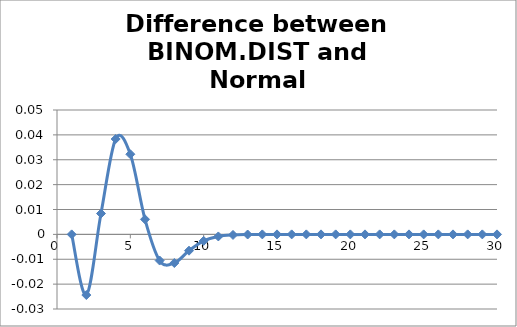
| Category | Series 0 |
|---|---|
| 0 | 0 |
| 1 | -0.024 |
| 2 | 0.008 |
| 3 | 0.038 |
| 4 | 0.032 |
| 5 | 0.006 |
| 6 | -0.011 |
| 7 | -0.012 |
| 8 | -0.007 |
| 9 | -0.003 |
| 10 | -0.001 |
| 11 | 0 |
| 12 | 0 |
| 13 | 0 |
| 14 | 0 |
| 15 | 0 |
| 16 | 0 |
| 17 | 0 |
| 18 | 0 |
| 19 | 0 |
| 20 | 0 |
| 21 | 0 |
| 22 | 0 |
| 23 | 0 |
| 24 | 0 |
| 25 | 0 |
| 26 | 0 |
| 27 | 0 |
| 28 | 0 |
| 29 | 0 |
| 30 | 0 |
| 31 | 0 |
| 32 | 0 |
| 33 | 0 |
| 34 | 0 |
| 35 | 0 |
| 36 | 0 |
| 37 | 0 |
| 38 | 0 |
| 39 | 0 |
| 40 | 0 |
| 41 | 0 |
| 42 | 0 |
| 43 | 0 |
| 44 | 0 |
| 45 | 0 |
| 46 | 0 |
| 47 | 0 |
| 48 | 0 |
| 49 | 0 |
| 50 | 0 |
| 51 | 0 |
| 52 | 0 |
| 53 | 0 |
| 54 | 0 |
| 55 | 0 |
| 56 | 0 |
| 57 | 0 |
| 58 | 0 |
| 59 | 0 |
| 60 | 0 |
| 61 | 0 |
| 62 | 0 |
| 63 | 0 |
| 64 | 0 |
| 65 | 0 |
| 66 | 0 |
| 67 | 0 |
| 68 | 0 |
| 69 | 0 |
| 70 | 0 |
| 71 | 0 |
| 72 | 0 |
| 73 | 0 |
| 74 | 0 |
| 75 | 0 |
| 76 | 0 |
| 77 | 0 |
| 78 | 0 |
| 79 | 0 |
| 80 | 0 |
| 81 | 0 |
| 82 | 0 |
| 83 | 0 |
| 84 | 0 |
| 85 | 0 |
| 86 | 0 |
| 87 | 0 |
| 88 | 0 |
| 89 | 0 |
| 90 | 0 |
| 91 | 0 |
| 92 | 0 |
| 93 | 0 |
| 94 | 0 |
| 95 | 0 |
| 96 | 0 |
| 97 | 0 |
| 98 | 0 |
| 99 | 0 |
| 100 | 0 |
| 101 | 0 |
| 102 | 0 |
| 103 | 0 |
| 104 | 0 |
| 105 | 0 |
| 106 | 0 |
| 107 | 0 |
| 108 | 0 |
| 109 | 0 |
| 110 | 0 |
| 111 | 0 |
| 112 | 0 |
| 113 | 0 |
| 114 | 0 |
| 115 | 0 |
| 116 | 0 |
| 117 | 0 |
| 118 | 0 |
| 119 | 0 |
| 120 | 0 |
| 121 | 0 |
| 122 | 0 |
| 123 | 0 |
| 124 | 0 |
| 125 | 0 |
| 126 | 0 |
| 127 | 0 |
| 128 | 0 |
| 129 | 0 |
| 130 | 0 |
| 131 | 0 |
| 132 | 0 |
| 133 | 0 |
| 134 | 0 |
| 135 | 0 |
| 136 | 0 |
| 137 | 0 |
| 138 | 0 |
| 139 | 0 |
| 140 | 0 |
| 141 | 0 |
| 142 | 0 |
| 143 | 0 |
| 144 | 0 |
| 145 | 0 |
| 146 | 0 |
| 147 | 0 |
| 148 | 0 |
| 149 | 0 |
| 150 | 0 |
| 151 | 0 |
| 152 | 0 |
| 153 | 0 |
| 154 | 0 |
| 155 | 0 |
| 156 | 0 |
| 157 | 0 |
| 158 | 0 |
| 159 | 0 |
| 160 | 0 |
| 161 | 0 |
| 162 | 0 |
| 163 | 0 |
| 164 | 0 |
| 165 | 0 |
| 166 | 0 |
| 167 | 0 |
| 168 | 0 |
| 169 | 0 |
| 170 | 0 |
| 171 | 0 |
| 172 | 0 |
| 173 | 0 |
| 174 | 0 |
| 175 | 0 |
| 176 | 0 |
| 177 | 0 |
| 178 | 0 |
| 179 | 0 |
| 180 | 0 |
| 181 | 0 |
| 182 | 0 |
| 183 | 0 |
| 184 | 0 |
| 185 | 0 |
| 186 | 0 |
| 187 | 0 |
| 188 | 0 |
| 189 | 0 |
| 190 | 0 |
| 191 | 0 |
| 192 | 0 |
| 193 | 0 |
| 194 | 0 |
| 195 | 0 |
| 196 | 0 |
| 197 | 0 |
| 198 | 0 |
| 199 | 0 |
| 200 | 0 |
| 201 | 0 |
| 202 | 0 |
| 203 | 0 |
| 204 | 0 |
| 205 | 0 |
| 206 | 0 |
| 207 | 0 |
| 208 | 0 |
| 209 | 0 |
| 210 | 0 |
| 211 | 0 |
| 212 | 0 |
| 213 | 0 |
| 214 | 0 |
| 215 | 0 |
| 216 | 0 |
| 217 | 0 |
| 218 | 0 |
| 219 | 0 |
| 220 | 0 |
| 221 | 0 |
| 222 | 0 |
| 223 | 0 |
| 224 | 0 |
| 225 | 0 |
| 226 | 0 |
| 227 | 0 |
| 228 | 0 |
| 229 | 0 |
| 230 | 0 |
| 231 | 0 |
| 232 | 0 |
| 233 | 0 |
| 234 | 0 |
| 235 | 0 |
| 236 | 0 |
| 237 | 0 |
| 238 | 0 |
| 239 | 0 |
| 240 | 0 |
| 241 | 0 |
| 242 | 0 |
| 243 | 0 |
| 244 | 0 |
| 245 | 0 |
| 246 | 0 |
| 247 | 0 |
| 248 | 0 |
| 249 | 0 |
| 250 | 0 |
| 251 | 0 |
| 252 | 0 |
| 253 | 0 |
| 254 | 0 |
| 255 | 0 |
| 256 | 0 |
| 257 | 0 |
| 258 | 0 |
| 259 | 0 |
| 260 | 0 |
| 261 | 0 |
| 262 | 0 |
| 263 | 0 |
| 264 | 0 |
| 265 | 0 |
| 266 | 0 |
| 267 | 0 |
| 268 | 0 |
| 269 | 0 |
| 270 | 0 |
| 271 | 0 |
| 272 | 0 |
| 273 | 0 |
| 274 | 0 |
| 275 | 0 |
| 276 | 0 |
| 277 | 0 |
| 278 | 0 |
| 279 | 0 |
| 280 | 0 |
| 281 | 0 |
| 282 | 0 |
| 283 | 0 |
| 284 | 0 |
| 285 | 0 |
| 286 | 0 |
| 287 | 0 |
| 288 | 0 |
| 289 | 0 |
| 290 | 0 |
| 291 | 0 |
| 292 | 0 |
| 293 | 0 |
| 294 | 0 |
| 295 | 0 |
| 296 | 0 |
| 297 | 0 |
| 298 | 0 |
| 299 | 0 |
| 300 | 0 |
| 301 | 0 |
| 302 | 0 |
| 303 | 0 |
| 304 | 0 |
| 305 | 0 |
| 306 | 0 |
| 307 | 0 |
| 308 | 0 |
| 309 | 0 |
| 310 | 0 |
| 311 | 0 |
| 312 | 0 |
| 313 | 0 |
| 314 | 0 |
| 315 | 0 |
| 316 | 0 |
| 317 | 0 |
| 318 | 0 |
| 319 | 0 |
| 320 | 0 |
| 321 | 0 |
| 322 | 0 |
| 323 | 0 |
| 324 | 0 |
| 325 | 0 |
| 326 | 0 |
| 327 | 0 |
| 328 | 0 |
| 329 | 0 |
| 330 | 0 |
| 331 | 0 |
| 332 | 0 |
| 333 | 0 |
| 334 | 0 |
| 335 | 0 |
| 336 | 0 |
| 337 | 0 |
| 338 | 0 |
| 339 | 0 |
| 340 | 0 |
| 341 | 0 |
| 342 | 0 |
| 343 | 0 |
| 344 | 0 |
| 345 | 0 |
| 346 | 0 |
| 347 | 0 |
| 348 | 0 |
| 349 | 0 |
| 350 | 0 |
| 351 | 0 |
| 352 | 0 |
| 353 | 0 |
| 354 | 0 |
| 355 | 0 |
| 356 | 0 |
| 357 | 0 |
| 358 | 0 |
| 359 | 0 |
| 360 | 0 |
| 361 | 0 |
| 362 | 0 |
| 363 | 0 |
| 364 | 0 |
| 365 | 0 |
| 366 | 0 |
| 367 | 0 |
| 368 | 0 |
| 369 | 0 |
| 370 | 0 |
| 371 | 0 |
| 372 | 0 |
| 373 | 0 |
| 374 | 0 |
| 375 | 0 |
| 376 | 0 |
| 377 | 0 |
| 378 | 0 |
| 379 | 0 |
| 380 | 0 |
| 381 | 0 |
| 382 | 0 |
| 383 | 0 |
| 384 | 0 |
| 385 | 0 |
| 386 | 0 |
| 387 | 0 |
| 388 | 0 |
| 389 | 0 |
| 390 | 0 |
| 391 | 0 |
| 392 | 0 |
| 393 | 0 |
| 394 | 0 |
| 395 | 0 |
| 396 | 0 |
| 397 | 0 |
| 398 | 0 |
| 399 | 0 |
| 400 | 0 |
| 401 | 0 |
| 402 | 0 |
| 403 | 0 |
| 404 | 0 |
| 405 | 0 |
| 406 | 0 |
| 407 | 0 |
| 408 | 0 |
| 409 | 0 |
| 410 | 0 |
| 411 | 0 |
| 412 | 0 |
| 413 | 0 |
| 414 | 0 |
| 415 | 0 |
| 416 | 0 |
| 417 | 0 |
| 418 | 0 |
| 419 | 0 |
| 420 | 0 |
| 421 | 0 |
| 422 | 0 |
| 423 | 0 |
| 424 | 0 |
| 425 | 0 |
| 426 | 0 |
| 427 | 0 |
| 428 | 0 |
| 429 | 0 |
| 430 | 0 |
| 431 | 0 |
| 432 | 0 |
| 433 | 0 |
| 434 | 0 |
| 435 | 0 |
| 436 | 0 |
| 437 | 0 |
| 438 | 0 |
| 439 | 0 |
| 440 | 0 |
| 441 | 0 |
| 442 | 0 |
| 443 | 0 |
| 444 | 0 |
| 445 | 0 |
| 446 | 0 |
| 447 | 0 |
| 448 | 0 |
| 449 | 0 |
| 450 | 0 |
| 451 | 0 |
| 452 | 0 |
| 453 | 0 |
| 454 | 0 |
| 455 | 0 |
| 456 | 0 |
| 457 | 0 |
| 458 | 0 |
| 459 | 0 |
| 460 | 0 |
| 461 | 0 |
| 462 | 0 |
| 463 | 0 |
| 464 | 0 |
| 465 | 0 |
| 466 | 0 |
| 467 | 0 |
| 468 | 0 |
| 469 | 0 |
| 470 | 0 |
| 471 | 0 |
| 472 | 0 |
| 473 | 0 |
| 474 | 0 |
| 475 | 0 |
| 476 | 0 |
| 477 | 0 |
| 478 | 0 |
| 479 | 0 |
| 480 | 0 |
| 481 | 0 |
| 482 | 0 |
| 483 | 0 |
| 484 | 0 |
| 485 | 0 |
| 486 | 0 |
| 487 | 0 |
| 488 | 0 |
| 489 | 0 |
| 490 | 0 |
| 491 | 0 |
| 492 | 0 |
| 493 | 0 |
| 494 | 0 |
| 495 | 0 |
| 496 | 0 |
| 497 | 0 |
| 498 | 0 |
| 499 | 0 |
| 500 | 0 |
| 501 | 0 |
| 502 | 0 |
| 503 | 0 |
| 504 | 0 |
| 505 | 0 |
| 506 | 0 |
| 507 | 0 |
| 508 | 0 |
| 509 | 0 |
| 510 | 0 |
| 511 | 0 |
| 512 | 0 |
| 513 | 0 |
| 514 | 0 |
| 515 | 0 |
| 516 | 0 |
| 517 | 0 |
| 518 | 0 |
| 519 | 0 |
| 520 | 0 |
| 521 | 0 |
| 522 | 0 |
| 523 | 0 |
| 524 | 0 |
| 525 | 0 |
| 526 | 0 |
| 527 | 0 |
| 528 | 0 |
| 529 | 0 |
| 530 | 0 |
| 531 | 0 |
| 532 | 0 |
| 533 | 0 |
| 534 | 0 |
| 535 | 0 |
| 536 | 0 |
| 537 | 0 |
| 538 | 0 |
| 539 | 0 |
| 540 | 0 |
| 541 | 0 |
| 542 | 0 |
| 543 | 0 |
| 544 | 0 |
| 545 | 0 |
| 546 | 0 |
| 547 | 0 |
| 548 | 0 |
| 549 | 0 |
| 550 | 0 |
| 551 | 0 |
| 552 | 0 |
| 553 | 0 |
| 554 | 0 |
| 555 | 0 |
| 556 | 0 |
| 557 | 0 |
| 558 | 0 |
| 559 | 0 |
| 560 | 0 |
| 561 | 0 |
| 562 | 0 |
| 563 | 0 |
| 564 | 0 |
| 565 | 0 |
| 566 | 0 |
| 567 | 0 |
| 568 | 0 |
| 569 | 0 |
| 570 | 0 |
| 571 | 0 |
| 572 | 0 |
| 573 | 0 |
| 574 | 0 |
| 575 | 0 |
| 576 | 0 |
| 577 | 0 |
| 578 | 0 |
| 579 | 0 |
| 580 | 0 |
| 581 | 0 |
| 582 | 0 |
| 583 | 0 |
| 584 | 0 |
| 585 | 0 |
| 586 | 0 |
| 587 | 0 |
| 588 | 0 |
| 589 | 0 |
| 590 | 0 |
| 591 | 0 |
| 592 | 0 |
| 593 | 0 |
| 594 | 0 |
| 595 | 0 |
| 596 | 0 |
| 597 | 0 |
| 598 | 0 |
| 599 | 0 |
| 600 | 0 |
| 601 | 0 |
| 602 | 0 |
| 603 | 0 |
| 604 | 0 |
| 605 | 0 |
| 606 | 0 |
| 607 | 0 |
| 608 | 0 |
| 609 | 0 |
| 610 | 0 |
| 611 | 0 |
| 612 | 0 |
| 613 | 0 |
| 614 | 0 |
| 615 | 0 |
| 616 | 0 |
| 617 | 0 |
| 618 | 0 |
| 619 | 0 |
| 620 | 0 |
| 621 | 0 |
| 622 | 0 |
| 623 | 0 |
| 624 | 0 |
| 625 | 0 |
| 626 | 0 |
| 627 | 0 |
| 628 | 0 |
| 629 | 0 |
| 630 | 0 |
| 631 | 0 |
| 632 | 0 |
| 633 | 0 |
| 634 | 0 |
| 635 | 0 |
| 636 | 0 |
| 637 | 0 |
| 638 | 0 |
| 639 | 0 |
| 640 | 0 |
| 641 | 0 |
| 642 | 0 |
| 643 | 0 |
| 644 | 0 |
| 645 | 0 |
| 646 | 0 |
| 647 | 0 |
| 648 | 0 |
| 649 | 0 |
| 650 | 0 |
| 651 | 0 |
| 652 | 0 |
| 653 | 0 |
| 654 | 0 |
| 655 | 0 |
| 656 | 0 |
| 657 | 0 |
| 658 | 0 |
| 659 | 0 |
| 660 | 0 |
| 661 | 0 |
| 662 | 0 |
| 663 | 0 |
| 664 | 0 |
| 665 | 0 |
| 666 | 0 |
| 667 | 0 |
| 668 | 0 |
| 669 | 0 |
| 670 | 0 |
| 671 | 0 |
| 672 | 0 |
| 673 | 0 |
| 674 | 0 |
| 675 | 0 |
| 676 | 0 |
| 677 | 0 |
| 678 | 0 |
| 679 | 0 |
| 680 | 0 |
| 681 | 0 |
| 682 | 0 |
| 683 | 0 |
| 684 | 0 |
| 685 | 0 |
| 686 | 0 |
| 687 | 0 |
| 688 | 0 |
| 689 | 0 |
| 690 | 0 |
| 691 | 0 |
| 692 | 0 |
| 693 | 0 |
| 694 | 0 |
| 695 | 0 |
| 696 | 0 |
| 697 | 0 |
| 698 | 0 |
| 699 | 0 |
| 700 | 0 |
| 701 | 0 |
| 702 | 0 |
| 703 | 0 |
| 704 | 0 |
| 705 | 0 |
| 706 | 0 |
| 707 | 0 |
| 708 | 0 |
| 709 | 0 |
| 710 | 0 |
| 711 | 0 |
| 712 | 0 |
| 713 | 0 |
| 714 | 0 |
| 715 | 0 |
| 716 | 0 |
| 717 | 0 |
| 718 | 0 |
| 719 | 0 |
| 720 | 0 |
| 721 | 0 |
| 722 | 0 |
| 723 | 0 |
| 724 | 0 |
| 725 | 0 |
| 726 | 0 |
| 727 | 0 |
| 728 | 0 |
| 729 | 0 |
| 730 | 0 |
| 731 | 0 |
| 732 | 0 |
| 733 | 0 |
| 734 | 0 |
| 735 | 0 |
| 736 | 0 |
| 737 | 0 |
| 738 | 0 |
| 739 | 0 |
| 740 | 0 |
| 741 | 0 |
| 742 | 0 |
| 743 | 0 |
| 744 | 0 |
| 745 | 0 |
| 746 | 0 |
| 747 | 0 |
| 748 | 0 |
| 749 | 0 |
| 750 | 0 |
| 751 | 0 |
| 752 | 0 |
| 753 | 0 |
| 754 | 0 |
| 755 | 0 |
| 756 | 0 |
| 757 | 0 |
| 758 | 0 |
| 759 | 0 |
| 760 | 0 |
| 761 | 0 |
| 762 | 0 |
| 763 | 0 |
| 764 | 0 |
| 765 | 0 |
| 766 | 0 |
| 767 | 0 |
| 768 | 0 |
| 769 | 0 |
| 770 | 0 |
| 771 | 0 |
| 772 | 0 |
| 773 | 0 |
| 774 | 0 |
| 775 | 0 |
| 776 | 0 |
| 777 | 0 |
| 778 | 0 |
| 779 | 0 |
| 780 | 0 |
| 781 | 0 |
| 782 | 0 |
| 783 | 0 |
| 784 | 0 |
| 785 | 0 |
| 786 | 0 |
| 787 | 0 |
| 788 | 0 |
| 789 | 0 |
| 790 | 0 |
| 791 | 0 |
| 792 | 0 |
| 793 | 0 |
| 794 | 0 |
| 795 | 0 |
| 796 | 0 |
| 797 | 0 |
| 798 | 0 |
| 799 | 0 |
| 800 | 0 |
| 801 | 0 |
| 802 | 0 |
| 803 | 0 |
| 804 | 0 |
| 805 | 0 |
| 806 | 0 |
| 807 | 0 |
| 808 | 0 |
| 809 | 0 |
| 810 | 0 |
| 811 | 0 |
| 812 | 0 |
| 813 | 0 |
| 814 | 0 |
| 815 | 0 |
| 816 | 0 |
| 817 | 0 |
| 818 | 0 |
| 819 | 0 |
| 820 | 0 |
| 821 | 0 |
| 822 | 0 |
| 823 | 0 |
| 824 | 0 |
| 825 | 0 |
| 826 | 0 |
| 827 | 0 |
| 828 | 0 |
| 829 | 0 |
| 830 | 0 |
| 831 | 0 |
| 832 | 0 |
| 833 | 0 |
| 834 | 0 |
| 835 | 0 |
| 836 | 0 |
| 837 | 0 |
| 838 | 0 |
| 839 | 0 |
| 840 | 0 |
| 841 | 0 |
| 842 | 0 |
| 843 | 0 |
| 844 | 0 |
| 845 | 0 |
| 846 | 0 |
| 847 | 0 |
| 848 | 0 |
| 849 | 0 |
| 850 | 0 |
| 851 | 0 |
| 852 | 0 |
| 853 | 0 |
| 854 | 0 |
| 855 | 0 |
| 856 | 0 |
| 857 | 0 |
| 858 | 0 |
| 859 | 0 |
| 860 | 0 |
| 861 | 0 |
| 862 | 0 |
| 863 | 0 |
| 864 | 0 |
| 865 | 0 |
| 866 | 0 |
| 867 | 0 |
| 868 | 0 |
| 869 | 0 |
| 870 | 0 |
| 871 | 0 |
| 872 | 0 |
| 873 | 0 |
| 874 | 0 |
| 875 | 0 |
| 876 | 0 |
| 877 | 0 |
| 878 | 0 |
| 879 | 0 |
| 880 | 0 |
| 881 | 0 |
| 882 | 0 |
| 883 | 0 |
| 884 | 0 |
| 885 | 0 |
| 886 | 0 |
| 887 | 0 |
| 888 | 0 |
| 889 | 0 |
| 890 | 0 |
| 891 | 0 |
| 892 | 0 |
| 893 | 0 |
| 894 | 0 |
| 895 | 0 |
| 896 | 0 |
| 897 | 0 |
| 898 | 0 |
| 899 | 0 |
| 900 | 0 |
| 901 | 0 |
| 902 | 0 |
| 903 | 0 |
| 904 | 0 |
| 905 | 0 |
| 906 | 0 |
| 907 | 0 |
| 908 | 0 |
| 909 | 0 |
| 910 | 0 |
| 911 | 0 |
| 912 | 0 |
| 913 | 0 |
| 914 | 0 |
| 915 | 0 |
| 916 | 0 |
| 917 | 0 |
| 918 | 0 |
| 919 | 0 |
| 920 | 0 |
| 921 | 0 |
| 922 | 0 |
| 923 | 0 |
| 924 | 0 |
| 925 | 0 |
| 926 | 0 |
| 927 | 0 |
| 928 | 0 |
| 929 | 0 |
| 930 | 0 |
| 931 | 0 |
| 932 | 0 |
| 933 | 0 |
| 934 | 0 |
| 935 | 0 |
| 936 | 0 |
| 937 | 0 |
| 938 | 0 |
| 939 | 0 |
| 940 | 0 |
| 941 | 0 |
| 942 | 0 |
| 943 | 0 |
| 944 | 0 |
| 945 | 0 |
| 946 | 0 |
| 947 | 0 |
| 948 | 0 |
| 949 | 0 |
| 950 | 0 |
| 951 | 0 |
| 952 | 0 |
| 953 | 0 |
| 954 | 0 |
| 955 | 0 |
| 956 | 0 |
| 957 | 0 |
| 958 | 0 |
| 959 | 0 |
| 960 | 0 |
| 961 | 0 |
| 962 | 0 |
| 963 | 0 |
| 964 | 0 |
| 965 | 0 |
| 966 | 0 |
| 967 | 0 |
| 968 | 0 |
| 969 | 0 |
| 970 | 0 |
| 971 | 0 |
| 972 | 0 |
| 973 | 0 |
| 974 | 0 |
| 975 | 0 |
| 976 | 0 |
| 977 | 0 |
| 978 | 0 |
| 979 | 0 |
| 980 | 0 |
| 981 | 0 |
| 982 | 0 |
| 983 | 0 |
| 984 | 0 |
| 985 | 0 |
| 986 | 0 |
| 987 | 0 |
| 988 | 0 |
| 989 | 0 |
| 990 | 0 |
| 991 | 0 |
| 992 | 0 |
| 993 | 0 |
| 994 | 0 |
| 995 | 0 |
| 996 | 0 |
| 997 | 0 |
| 998 | 0 |
| 999 | 0 |
| 1000 | 0 |
| 1001 | 0 |
| 1002 | 0 |
| 1003 | 0 |
| 1004 | 0 |
| 1005 | 0 |
| 1006 | 0 |
| 1007 | 0 |
| 1008 | 0 |
| 1009 | 0 |
| 1010 | 0 |
| 1011 | 0 |
| 1012 | 0 |
| 1013 | 0 |
| 1014 | 0 |
| 1015 | 0 |
| 1016 | 0 |
| 1017 | 0 |
| 1018 | 0 |
| 1019 | 0 |
| 1020 | 0 |
| 1021 | 0 |
| 1022 | 0 |
| 1023 | 0 |
| 1024 | 0 |
| 1025 | 0 |
| 1026 | 0 |
| 1027 | 0 |
| 1028 | 0 |
| 1029 | 0 |
| 1030 | 0 |
| 1031 | 0 |
| 1032 | 0 |
| 1033 | 0 |
| 1034 | 0 |
| 1035 | 0 |
| 1036 | 0 |
| 1037 | 0 |
| 1038 | 0 |
| 1039 | 0 |
| 1040 | 0 |
| 1041 | 0 |
| 1042 | 0 |
| 1043 | 0 |
| 1044 | 0 |
| 1045 | 0 |
| 1046 | 0 |
| 1047 | 0 |
| 1048 | 0 |
| 1049 | 0 |
| 1050 | 0 |
| 1051 | 0 |
| 1052 | 0 |
| 1053 | 0 |
| 1054 | 0 |
| 1055 | 0 |
| 1056 | 0 |
| 1057 | 0 |
| 1058 | 0 |
| 1059 | 0 |
| 1060 | 0 |
| 1061 | 0 |
| 1062 | 0 |
| 1063 | 0 |
| 1064 | 0 |
| 1065 | 0 |
| 1066 | 0 |
| 1067 | 0 |
| 1068 | 0 |
| 1069 | 0 |
| 1070 | 0 |
| 1071 | 0 |
| 1072 | 0 |
| 1073 | 0 |
| 1074 | 0 |
| 1075 | 0 |
| 1076 | 0 |
| 1077 | 0 |
| 1078 | 0 |
| 1079 | 0 |
| 1080 | 0 |
| 1081 | 0 |
| 1082 | 0 |
| 1083 | 0 |
| 1084 | 0 |
| 1085 | 0 |
| 1086 | 0 |
| 1087 | 0 |
| 1088 | 0 |
| 1089 | 0 |
| 1090 | 0 |
| 1091 | 0 |
| 1092 | 0 |
| 1093 | 0 |
| 1094 | 0 |
| 1095 | 0 |
| 1096 | 0 |
| 1097 | 0 |
| 1098 | 0 |
| 1099 | 0 |
| 1100 | 0 |
| 1101 | 0 |
| 1102 | 0 |
| 1103 | 0 |
| 1104 | 0 |
| 1105 | 0 |
| 1106 | 0 |
| 1107 | 0 |
| 1108 | 0 |
| 1109 | 0 |
| 1110 | 0 |
| 1111 | 0 |
| 1112 | 0 |
| 1113 | 0 |
| 1114 | 0 |
| 1115 | 0 |
| 1116 | 0 |
| 1117 | 0 |
| 1118 | 0 |
| 1119 | 0 |
| 1120 | 0 |
| 1121 | 0 |
| 1122 | 0 |
| 1123 | 0 |
| 1124 | 0 |
| 1125 | 0 |
| 1126 | 0 |
| 1127 | 0 |
| 1128 | 0 |
| 1129 | 0 |
| 1130 | 0 |
| 1131 | 0 |
| 1132 | 0 |
| 1133 | 0 |
| 1134 | 0 |
| 1135 | 0 |
| 1136 | 0 |
| 1137 | 0 |
| 1138 | 0 |
| 1139 | 0 |
| 1140 | 0 |
| 1141 | 0 |
| 1142 | 0 |
| 1143 | 0 |
| 1144 | 0 |
| 1145 | 0 |
| 1146 | 0 |
| 1147 | 0 |
| 1148 | 0 |
| 1149 | 0 |
| 1150 | 0 |
| 1151 | 0 |
| 1152 | 0 |
| 1153 | 0 |
| 1154 | 0 |
| 1155 | 0 |
| 1156 | 0 |
| 1157 | 0 |
| 1158 | 0 |
| 1159 | 0 |
| 1160 | 0 |
| 1161 | 0 |
| 1162 | 0 |
| 1163 | 0 |
| 1164 | 0 |
| 1165 | 0 |
| 1166 | 0 |
| 1167 | 0 |
| 1168 | 0 |
| 1169 | 0 |
| 1170 | 0 |
| 1171 | 0 |
| 1172 | 0 |
| 1173 | 0 |
| 1174 | 0 |
| 1175 | 0 |
| 1176 | 0 |
| 1177 | 0 |
| 1178 | 0 |
| 1179 | 0 |
| 1180 | 0 |
| 1181 | 0 |
| 1182 | 0 |
| 1183 | 0 |
| 1184 | 0 |
| 1185 | 0 |
| 1186 | 0 |
| 1187 | 0 |
| 1188 | 0 |
| 1189 | 0 |
| 1190 | 0 |
| 1191 | 0 |
| 1192 | 0 |
| 1193 | 0 |
| 1194 | 0 |
| 1195 | 0 |
| 1196 | 0 |
| 1197 | 0 |
| 1198 | 0 |
| 1199 | 0 |
| 1200 | 0 |
| 1201 | 0 |
| 1202 | 0 |
| 1203 | 0 |
| 1204 | 0 |
| 1205 | 0 |
| 1206 | 0 |
| 1207 | 0 |
| 1208 | 0 |
| 1209 | 0 |
| 1210 | 0 |
| 1211 | 0 |
| 1212 | 0 |
| 1213 | 0 |
| 1214 | 0 |
| 1215 | 0 |
| 1216 | 0 |
| 1217 | 0 |
| 1218 | 0 |
| 1219 | 0 |
| 1220 | 0 |
| 1221 | 0 |
| 1222 | 0 |
| 1223 | 0 |
| 1224 | 0 |
| 1225 | 0 |
| 1226 | 0 |
| 1227 | 0 |
| 1228 | 0 |
| 1229 | 0 |
| 1230 | 0 |
| 1231 | 0 |
| 1232 | 0 |
| 1233 | 0 |
| 1234 | 0 |
| 1235 | 0 |
| 1236 | 0 |
| 1237 | 0 |
| 1238 | 0 |
| 1239 | 0 |
| 1240 | 0 |
| 1241 | 0 |
| 1242 | 0 |
| 1243 | 0 |
| 1244 | 0 |
| 1245 | 0 |
| 1246 | 0 |
| 1247 | 0 |
| 1248 | 0 |
| 1249 | 0 |
| 1250 | 0 |
| 1251 | 0 |
| 1252 | 0 |
| 1253 | 0 |
| 1254 | 0 |
| 1255 | 0 |
| 1256 | 0 |
| 1257 | 0 |
| 1258 | 0 |
| 1259 | 0 |
| 1260 | 0 |
| 1261 | 0 |
| 1262 | 0 |
| 1263 | 0 |
| 1264 | 0 |
| 1265 | 0 |
| 1266 | 0 |
| 1267 | 0 |
| 1268 | 0 |
| 1269 | 0 |
| 1270 | 0 |
| 1271 | 0 |
| 1272 | 0 |
| 1273 | 0 |
| 1274 | 0 |
| 1275 | 0 |
| 1276 | 0 |
| 1277 | 0 |
| 1278 | 0 |
| 1279 | 0 |
| 1280 | 0 |
| 1281 | 0 |
| 1282 | 0 |
| 1283 | 0 |
| 1284 | 0 |
| 1285 | 0 |
| 1286 | 0 |
| 1287 | 0 |
| 1288 | 0 |
| 1289 | 0 |
| 1290 | 0 |
| 1291 | 0 |
| 1292 | 0 |
| 1293 | 0 |
| 1294 | 0 |
| 1295 | 0 |
| 1296 | 0 |
| 1297 | 0 |
| 1298 | 0 |
| 1299 | 0 |
| 1300 | 0 |
| 1301 | 0 |
| 1302 | 0 |
| 1303 | 0 |
| 1304 | 0 |
| 1305 | 0 |
| 1306 | 0 |
| 1307 | 0 |
| 1308 | 0 |
| 1309 | 0 |
| 1310 | 0 |
| 1311 | 0 |
| 1312 | 0 |
| 1313 | 0 |
| 1314 | 0 |
| 1315 | 0 |
| 1316 | 0 |
| 1317 | 0 |
| 1318 | 0 |
| 1319 | 0 |
| 1320 | 0 |
| 1321 | 0 |
| 1322 | 0 |
| 1323 | 0 |
| 1324 | 0 |
| 1325 | 0 |
| 1326 | 0 |
| 1327 | 0 |
| 1328 | 0 |
| 1329 | 0 |
| 1330 | 0 |
| 1331 | 0 |
| 1332 | 0 |
| 1333 | 0 |
| 1334 | 0 |
| 1335 | 0 |
| 1336 | 0 |
| 1337 | 0 |
| 1338 | 0 |
| 1339 | 0 |
| 1340 | 0 |
| 1341 | 0 |
| 1342 | 0 |
| 1343 | 0 |
| 1344 | 0 |
| 1345 | 0 |
| 1346 | 0 |
| 1347 | 0 |
| 1348 | 0 |
| 1349 | 0 |
| 1350 | 0 |
| 1351 | 0 |
| 1352 | 0 |
| 1353 | 0 |
| 1354 | 0 |
| 1355 | 0 |
| 1356 | 0 |
| 1357 | 0 |
| 1358 | 0 |
| 1359 | 0 |
| 1360 | 0 |
| 1361 | 0 |
| 1362 | 0 |
| 1363 | 0 |
| 1364 | 0 |
| 1365 | 0 |
| 1366 | 0 |
| 1367 | 0 |
| 1368 | 0 |
| 1369 | 0 |
| 1370 | 0 |
| 1371 | 0 |
| 1372 | 0 |
| 1373 | 0 |
| 1374 | 0 |
| 1375 | 0 |
| 1376 | 0 |
| 1377 | 0 |
| 1378 | 0 |
| 1379 | 0 |
| 1380 | 0 |
| 1381 | 0 |
| 1382 | 0 |
| 1383 | 0 |
| 1384 | 0 |
| 1385 | 0 |
| 1386 | 0 |
| 1387 | 0 |
| 1388 | 0 |
| 1389 | 0 |
| 1390 | 0 |
| 1391 | 0 |
| 1392 | 0 |
| 1393 | 0 |
| 1394 | 0 |
| 1395 | 0 |
| 1396 | 0 |
| 1397 | 0 |
| 1398 | 0 |
| 1399 | 0 |
| 1400 | 0 |
| 1401 | 0 |
| 1402 | 0 |
| 1403 | 0 |
| 1404 | 0 |
| 1405 | 0 |
| 1406 | 0 |
| 1407 | 0 |
| 1408 | 0 |
| 1409 | 0 |
| 1410 | 0 |
| 1411 | 0 |
| 1412 | 0 |
| 1413 | 0 |
| 1414 | 0 |
| 1415 | 0 |
| 1416 | 0 |
| 1417 | 0 |
| 1418 | 0 |
| 1419 | 0 |
| 1420 | 0 |
| 1421 | 0 |
| 1422 | 0 |
| 1423 | 0 |
| 1424 | 0 |
| 1425 | 0 |
| 1426 | 0 |
| 1427 | 0 |
| 1428 | 0 |
| 1429 | 0 |
| 1430 | 0 |
| 1431 | 0 |
| 1432 | 0 |
| 1433 | 0 |
| 1434 | 0 |
| 1435 | 0 |
| 1436 | 0 |
| 1437 | 0 |
| 1438 | 0 |
| 1439 | 0 |
| 1440 | 0 |
| 1441 | 0 |
| 1442 | 0 |
| 1443 | 0 |
| 1444 | 0 |
| 1445 | 0 |
| 1446 | 0 |
| 1447 | 0 |
| 1448 | 0 |
| 1449 | 0 |
| 1450 | 0 |
| 1451 | 0 |
| 1452 | 0 |
| 1453 | 0 |
| 1454 | 0 |
| 1455 | 0 |
| 1456 | 0 |
| 1457 | 0 |
| 1458 | 0 |
| 1459 | 0 |
| 1460 | 0 |
| 1461 | 0 |
| 1462 | 0 |
| 1463 | 0 |
| 1464 | 0 |
| 1465 | 0 |
| 1466 | 0 |
| 1467 | 0 |
| 1468 | 0 |
| 1469 | 0 |
| 1470 | 0 |
| 1471 | 0 |
| 1472 | 0 |
| 1473 | 0 |
| 1474 | 0 |
| 1475 | 0 |
| 1476 | 0 |
| 1477 | 0 |
| 1478 | 0 |
| 1479 | 0 |
| 1480 | 0 |
| 1481 | 0 |
| 1482 | 0 |
| 1483 | 0 |
| 1484 | 0 |
| 1485 | 0 |
| 1486 | 0 |
| 1487 | 0 |
| 1488 | 0 |
| 1489 | 0 |
| 1490 | 0 |
| 1491 | 0 |
| 1492 | 0 |
| 1493 | 0 |
| 1494 | 0 |
| 1495 | 0 |
| 1496 | 0 |
| 1497 | 0 |
| 1498 | 0 |
| 1499 | 0 |
| 1500 | 0 |
| 1501 | 0 |
| 1502 | 0 |
| 1503 | 0 |
| 1504 | 0 |
| 1505 | 0 |
| 1506 | 0 |
| 1507 | 0 |
| 1508 | 0 |
| 1509 | 0 |
| 1510 | 0 |
| 1511 | 0 |
| 1512 | 0 |
| 1513 | 0 |
| 1514 | 0 |
| 1515 | 0 |
| 1516 | 0 |
| 1517 | 0 |
| 1518 | 0 |
| 1519 | 0 |
| 1520 | 0 |
| 1521 | 0 |
| 1522 | 0 |
| 1523 | 0 |
| 1524 | 0 |
| 1525 | 0 |
| 1526 | 0 |
| 1527 | 0 |
| 1528 | 0 |
| 1529 | 0 |
| 1530 | 0 |
| 1531 | 0 |
| 1532 | 0 |
| 1533 | 0 |
| 1534 | 0 |
| 1535 | 0 |
| 1536 | 0 |
| 1537 | 0 |
| 1538 | 0 |
| 1539 | 0 |
| 1540 | 0 |
| 1541 | 0 |
| 1542 | 0 |
| 1543 | 0 |
| 1544 | 0 |
| 1545 | 0 |
| 1546 | 0 |
| 1547 | 0 |
| 1548 | 0 |
| 1549 | 0 |
| 1550 | 0 |
| 1551 | 0 |
| 1552 | 0 |
| 1553 | 0 |
| 1554 | 0 |
| 1555 | 0 |
| 1556 | 0 |
| 1557 | 0 |
| 1558 | 0 |
| 1559 | 0 |
| 1560 | 0 |
| 1561 | 0 |
| 1562 | 0 |
| 1563 | 0 |
| 1564 | 0 |
| 1565 | 0 |
| 1566 | 0 |
| 1567 | 0 |
| 1568 | 0 |
| 1569 | 0 |
| 1570 | 0 |
| 1571 | 0 |
| 1572 | 0 |
| 1573 | 0 |
| 1574 | 0 |
| 1575 | 0 |
| 1576 | 0 |
| 1577 | 0 |
| 1578 | 0 |
| 1579 | 0 |
| 1580 | 0 |
| 1581 | 0 |
| 1582 | 0 |
| 1583 | 0 |
| 1584 | 0 |
| 1585 | 0 |
| 1586 | 0 |
| 1587 | 0 |
| 1588 | 0 |
| 1589 | 0 |
| 1590 | 0 |
| 1591 | 0 |
| 1592 | 0 |
| 1593 | 0 |
| 1594 | 0 |
| 1595 | 0 |
| 1596 | 0 |
| 1597 | 0 |
| 1598 | 0 |
| 1599 | 0 |
| 1600 | 0 |
| 1601 | 0 |
| 1602 | 0 |
| 1603 | 0 |
| 1604 | 0 |
| 1605 | 0 |
| 1606 | 0 |
| 1607 | 0 |
| 1608 | 0 |
| 1609 | 0 |
| 1610 | 0 |
| 1611 | 0 |
| 1612 | 0 |
| 1613 | 0 |
| 1614 | 0 |
| 1615 | 0 |
| 1616 | 0 |
| 1617 | 0 |
| 1618 | 0 |
| 1619 | 0 |
| 1620 | 0 |
| 1621 | 0 |
| 1622 | 0 |
| 1623 | 0 |
| 1624 | 0 |
| 1625 | 0 |
| 1626 | 0 |
| 1627 | 0 |
| 1628 | 0 |
| 1629 | 0 |
| 1630 | 0 |
| 1631 | 0 |
| 1632 | 0 |
| 1633 | 0 |
| 1634 | 0 |
| 1635 | 0 |
| 1636 | 0 |
| 1637 | 0 |
| 1638 | 0 |
| 1639 | 0 |
| 1640 | 0 |
| 1641 | 0 |
| 1642 | 0 |
| 1643 | 0 |
| 1644 | 0 |
| 1645 | 0 |
| 1646 | 0 |
| 1647 | 0 |
| 1648 | 0 |
| 1649 | 0 |
| 1650 | 0 |
| 1651 | 0 |
| 1652 | 0 |
| 1653 | 0 |
| 1654 | 0 |
| 1655 | 0 |
| 1656 | 0 |
| 1657 | 0 |
| 1658 | 0 |
| 1659 | 0 |
| 1660 | 0 |
| 1661 | 0 |
| 1662 | 0 |
| 1663 | 0 |
| 1664 | 0 |
| 1665 | 0 |
| 1666 | 0 |
| 1667 | 0 |
| 1668 | 0 |
| 1669 | 0 |
| 1670 | 0 |
| 1671 | 0 |
| 1672 | 0 |
| 1673 | 0 |
| 1674 | 0 |
| 1675 | 0 |
| 1676 | 0 |
| 1677 | 0 |
| 1678 | 0 |
| 1679 | 0 |
| 1680 | 0 |
| 1681 | 0 |
| 1682 | 0 |
| 1683 | 0 |
| 1684 | 0 |
| 1685 | 0 |
| 1686 | 0 |
| 1687 | 0 |
| 1688 | 0 |
| 1689 | 0 |
| 1690 | 0 |
| 1691 | 0 |
| 1692 | 0 |
| 1693 | 0 |
| 1694 | 0 |
| 1695 | 0 |
| 1696 | 0 |
| 1697 | 0 |
| 1698 | 0 |
| 1699 | 0 |
| 1700 | 0 |
| 1701 | 0 |
| 1702 | 0 |
| 1703 | 0 |
| 1704 | 0 |
| 1705 | 0 |
| 1706 | 0 |
| 1707 | 0 |
| 1708 | 0 |
| 1709 | 0 |
| 1710 | 0 |
| 1711 | 0 |
| 1712 | 0 |
| 1713 | 0 |
| 1714 | 0 |
| 1715 | 0 |
| 1716 | 0 |
| 1717 | 0 |
| 1718 | 0 |
| 1719 | 0 |
| 1720 | 0 |
| 1721 | 0 |
| 1722 | 0 |
| 1723 | 0 |
| 1724 | 0 |
| 1725 | 0 |
| 1726 | 0 |
| 1727 | 0 |
| 1728 | 0 |
| 1729 | 0 |
| 1730 | 0 |
| 1731 | 0 |
| 1732 | 0 |
| 1733 | 0 |
| 1734 | 0 |
| 1735 | 0 |
| 1736 | 0 |
| 1737 | 0 |
| 1738 | 0 |
| 1739 | 0 |
| 1740 | 0 |
| 1741 | 0 |
| 1742 | 0 |
| 1743 | 0 |
| 1744 | 0 |
| 1745 | 0 |
| 1746 | 0 |
| 1747 | 0 |
| 1748 | 0 |
| 1749 | 0 |
| 1750 | 0 |
| 1751 | 0 |
| 1752 | 0 |
| 1753 | 0 |
| 1754 | 0 |
| 1755 | 0 |
| 1756 | 0 |
| 1757 | 0 |
| 1758 | 0 |
| 1759 | 0 |
| 1760 | 0 |
| 1761 | 0 |
| 1762 | 0 |
| 1763 | 0 |
| 1764 | 0 |
| 1765 | 0 |
| 1766 | 0 |
| 1767 | 0 |
| 1768 | 0 |
| 1769 | 0 |
| 1770 | 0 |
| 1771 | 0 |
| 1772 | 0 |
| 1773 | 0 |
| 1774 | 0 |
| 1775 | 0 |
| 1776 | 0 |
| 1777 | 0 |
| 1778 | 0 |
| 1779 | 0 |
| 1780 | 0 |
| 1781 | 0 |
| 1782 | 0 |
| 1783 | 0 |
| 1784 | 0 |
| 1785 | 0 |
| 1786 | 0 |
| 1787 | 0 |
| 1788 | 0 |
| 1789 | 0 |
| 1790 | 0 |
| 1791 | 0 |
| 1792 | 0 |
| 1793 | 0 |
| 1794 | 0 |
| 1795 | 0 |
| 1796 | 0 |
| 1797 | 0 |
| 1798 | 0 |
| 1799 | 0 |
| 1800 | 0 |
| 1801 | 0 |
| 1802 | 0 |
| 1803 | 0 |
| 1804 | 0 |
| 1805 | 0 |
| 1806 | 0 |
| 1807 | 0 |
| 1808 | 0 |
| 1809 | 0 |
| 1810 | 0 |
| 1811 | 0 |
| 1812 | 0 |
| 1813 | 0 |
| 1814 | 0 |
| 1815 | 0 |
| 1816 | 0 |
| 1817 | 0 |
| 1818 | 0 |
| 1819 | 0 |
| 1820 | 0 |
| 1821 | 0 |
| 1822 | 0 |
| 1823 | 0 |
| 1824 | 0 |
| 1825 | 0 |
| 1826 | 0 |
| 1827 | 0 |
| 1828 | 0 |
| 1829 | 0 |
| 1830 | 0 |
| 1831 | 0 |
| 1832 | 0 |
| 1833 | 0 |
| 1834 | 0 |
| 1835 | 0 |
| 1836 | 0 |
| 1837 | 0 |
| 1838 | 0 |
| 1839 | 0 |
| 1840 | 0 |
| 1841 | 0 |
| 1842 | 0 |
| 1843 | 0 |
| 1844 | 0 |
| 1845 | 0 |
| 1846 | 0 |
| 1847 | 0 |
| 1848 | 0 |
| 1849 | 0 |
| 1850 | 0 |
| 1851 | 0 |
| 1852 | 0 |
| 1853 | 0 |
| 1854 | 0 |
| 1855 | 0 |
| 1856 | 0 |
| 1857 | 0 |
| 1858 | 0 |
| 1859 | 0 |
| 1860 | 0 |
| 1861 | 0 |
| 1862 | 0 |
| 1863 | 0 |
| 1864 | 0 |
| 1865 | 0 |
| 1866 | 0 |
| 1867 | 0 |
| 1868 | 0 |
| 1869 | 0 |
| 1870 | 0 |
| 1871 | 0 |
| 1872 | 0 |
| 1873 | 0 |
| 1874 | 0 |
| 1875 | 0 |
| 1876 | 0 |
| 1877 | 0 |
| 1878 | 0 |
| 1879 | 0 |
| 1880 | 0 |
| 1881 | 0 |
| 1882 | 0 |
| 1883 | 0 |
| 1884 | 0 |
| 1885 | 0 |
| 1886 | 0 |
| 1887 | 0 |
| 1888 | 0 |
| 1889 | 0 |
| 1890 | 0 |
| 1891 | 0 |
| 1892 | 0 |
| 1893 | 0 |
| 1894 | 0 |
| 1895 | 0 |
| 1896 | 0 |
| 1897 | 0 |
| 1898 | 0 |
| 1899 | 0 |
| 1900 | 0 |
| 1901 | 0 |
| 1902 | 0 |
| 1903 | 0 |
| 1904 | 0 |
| 1905 | 0 |
| 1906 | 0 |
| 1907 | 0 |
| 1908 | 0 |
| 1909 | 0 |
| 1910 | 0 |
| 1911 | 0 |
| 1912 | 0 |
| 1913 | 0 |
| 1914 | 0 |
| 1915 | 0 |
| 1916 | 0 |
| 1917 | 0 |
| 1918 | 0 |
| 1919 | 0 |
| 1920 | 0 |
| 1921 | 0 |
| 1922 | 0 |
| 1923 | 0 |
| 1924 | 0 |
| 1925 | 0 |
| 1926 | 0 |
| 1927 | 0 |
| 1928 | 0 |
| 1929 | 0 |
| 1930 | 0 |
| 1931 | 0 |
| 1932 | 0 |
| 1933 | 0 |
| 1934 | 0 |
| 1935 | 0 |
| 1936 | 0 |
| 1937 | 0 |
| 1938 | 0 |
| 1939 | 0 |
| 1940 | 0 |
| 1941 | 0 |
| 1942 | 0 |
| 1943 | 0 |
| 1944 | 0 |
| 1945 | 0 |
| 1946 | 0 |
| 1947 | 0 |
| 1948 | 0 |
| 1949 | 0 |
| 1950 | 0 |
| 1951 | 0 |
| 1952 | 0 |
| 1953 | 0 |
| 1954 | 0 |
| 1955 | 0 |
| 1956 | 0 |
| 1957 | 0 |
| 1958 | 0 |
| 1959 | 0 |
| 1960 | 0 |
| 1961 | 0 |
| 1962 | 0 |
| 1963 | 0 |
| 1964 | 0 |
| 1965 | 0 |
| 1966 | 0 |
| 1967 | 0 |
| 1968 | 0 |
| 1969 | 0 |
| 1970 | 0 |
| 1971 | 0 |
| 1972 | 0 |
| 1973 | 0 |
| 1974 | 0 |
| 1975 | 0 |
| 1976 | 0 |
| 1977 | 0 |
| 1978 | 0 |
| 1979 | 0 |
| 1980 | 0 |
| 1981 | 0 |
| 1982 | 0 |
| 1983 | 0 |
| 1984 | 0 |
| 1985 | 0 |
| 1986 | 0 |
| 1987 | 0 |
| 1988 | 0 |
| 1989 | 0 |
| 1990 | 0 |
| 1991 | 0 |
| 1992 | 0 |
| 1993 | 0 |
| 1994 | 0 |
| 1995 | 0 |
| 1996 | 0 |
| 1997 | 0 |
| 1998 | 0 |
| 1999 | 0 |
| 2000 | 0 |
| 2001 | 0 |